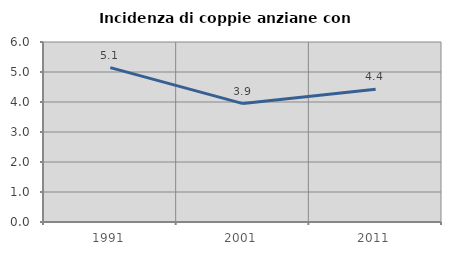
| Category | Incidenza di coppie anziane con figli |
|---|---|
| 1991.0 | 5.145 |
| 2001.0 | 3.947 |
| 2011.0 | 4.428 |